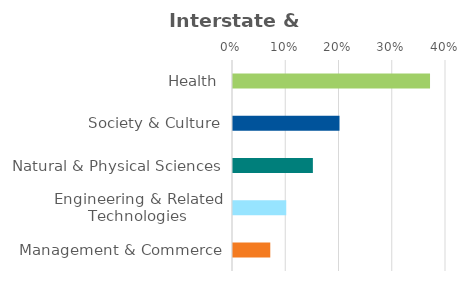
| Category | Series 0 |
|---|---|
| Health | 0.37 |
| Society & Culture | 0.2 |
| Natural & Physical Sciences | 0.15 |
| Engineering & Related Technologies | 0.1 |
| Management & Commerce | 0.07 |